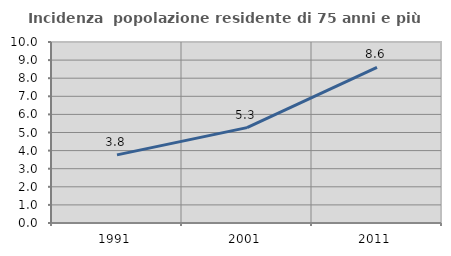
| Category | Incidenza  popolazione residente di 75 anni e più |
|---|---|
| 1991.0 | 3.765 |
| 2001.0 | 5.271 |
| 2011.0 | 8.595 |